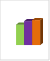
| Category | област Ловеч |
|---|---|
| летен сезон 2019  | 111631 |
| летен сезон 2021  | 130654 |
| летен сезон 2022 г.  | 136507 |